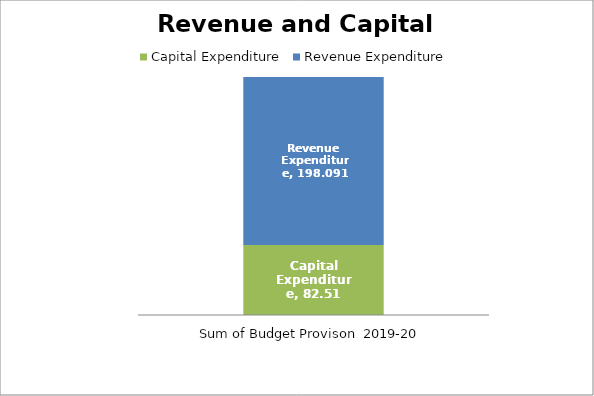
| Category | Capital Expenditure | Revenue Expenditure |
|---|---|---|
| Sum of Budget Provison  2019-20 | 82.51 | 198.091 |